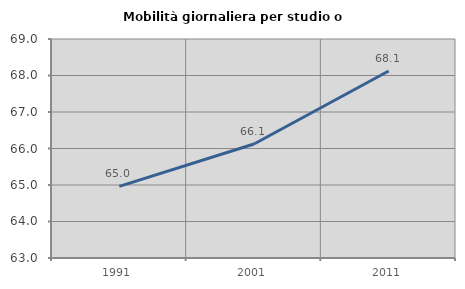
| Category | Mobilità giornaliera per studio o lavoro |
|---|---|
| 1991.0 | 64.963 |
| 2001.0 | 66.125 |
| 2011.0 | 68.124 |